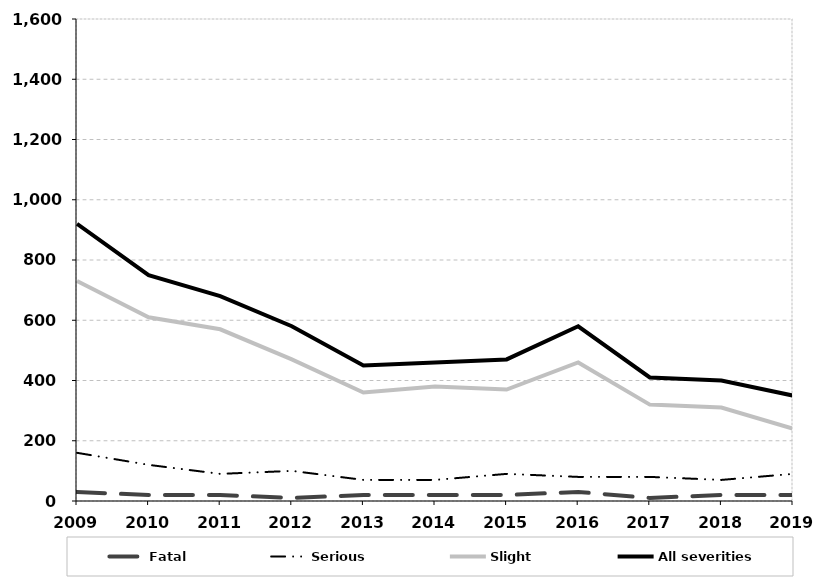
| Category | Fatal | Serious | Slight | All severities |
|---|---|---|---|---|
| 2009.0 | 30 | 160 | 730 | 920 |
| 2010.0 | 20 | 120 | 610 | 750 |
| 2011.0 | 20 | 90 | 570 | 680 |
| 2012.0 | 10 | 100 | 470 | 580 |
| 2013.0 | 20 | 70 | 360 | 450 |
| 2014.0 | 20 | 70 | 380 | 460 |
| 2015.0 | 20 | 90 | 370 | 470 |
| 2016.0 | 30 | 80 | 460 | 580 |
| 2017.0 | 10 | 80 | 320 | 410 |
| 2018.0 | 20 | 70 | 310 | 400 |
| 2019.0 | 20 | 90 | 240 | 350 |